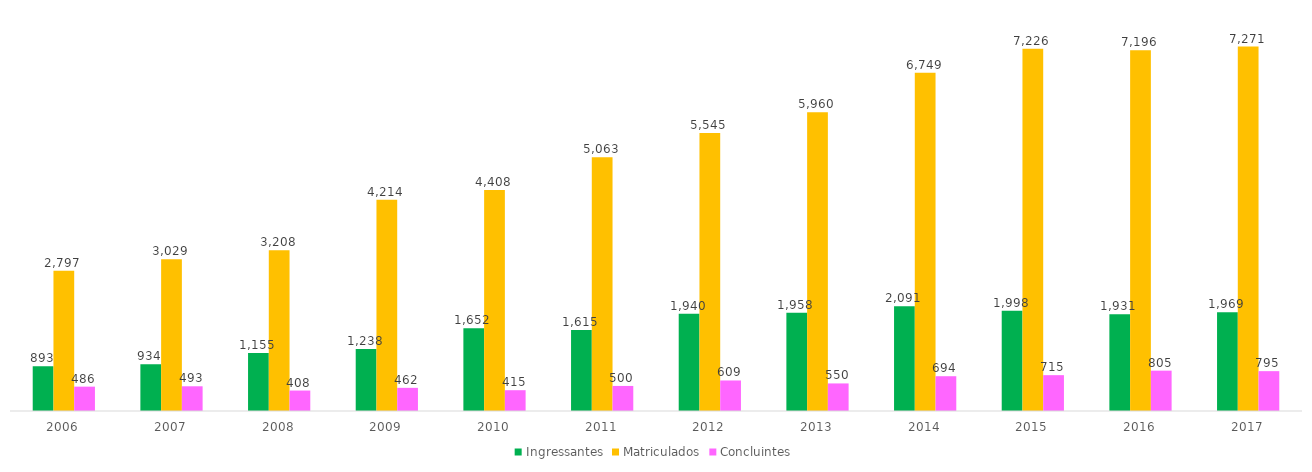
| Category | Ingressantes | Matriculados | Concluintes |
|---|---|---|---|
| 2006.0 | 893 | 2797 | 486 |
| 2007.0 | 934 | 3029 | 493 |
| 2008.0 | 1155 | 3208 | 408 |
| 2009.0 | 1238 | 4214 | 462 |
| 2010.0 | 1652 | 4408 | 415 |
| 2011.0 | 1615 | 5063 | 500 |
| 2012.0 | 1940 | 5545 | 609 |
| 2013.0 | 1958 | 5960 | 550 |
| 2014.0 | 2091 | 6749 | 694 |
| 2015.0 | 1998 | 7226 | 715 |
| 2016.0 | 1931 | 7196 | 805 |
| 2017.0 | 1969 | 7271 | 795 |